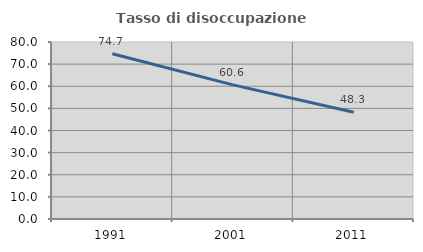
| Category | Tasso di disoccupazione giovanile  |
|---|---|
| 1991.0 | 74.701 |
| 2001.0 | 60.625 |
| 2011.0 | 48.288 |